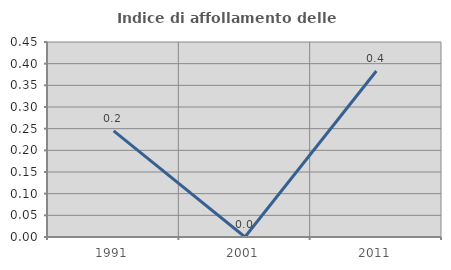
| Category | Indice di affollamento delle abitazioni  |
|---|---|
| 1991.0 | 0.245 |
| 2001.0 | 0 |
| 2011.0 | 0.383 |